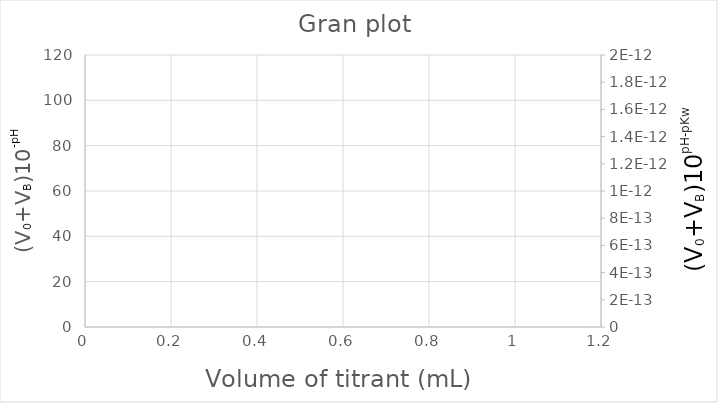
| Category | Series 0 |
|---|---|
|  | 100 |
|  | 100 |
|  | 100 |
|  | 100 |
|  | 100 |
|  | 100 |